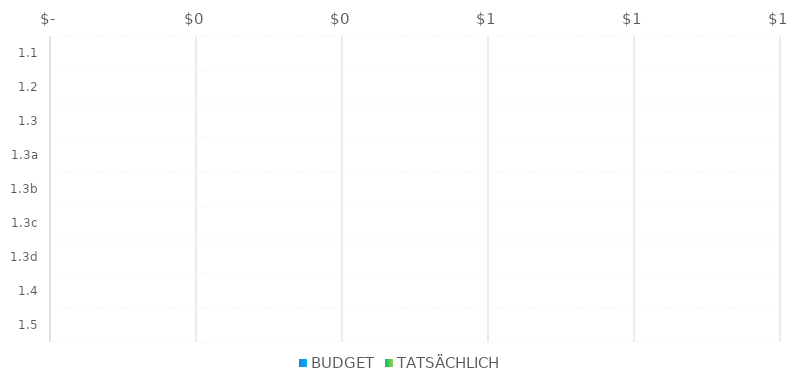
| Category | BUDGET | TATSÄCHLICH |
|---|---|---|
| 1.1 |  | 0 |
| 1.2 |  | 0 |
| 1.3 |  | 0 |
| 1.3a |  | 0 |
| 1.3b |  | 0 |
| 1.3c |  | 0 |
| 1.3d |  | 0 |
| 1.4 |  | 0 |
| 1.5 |  | 0 |